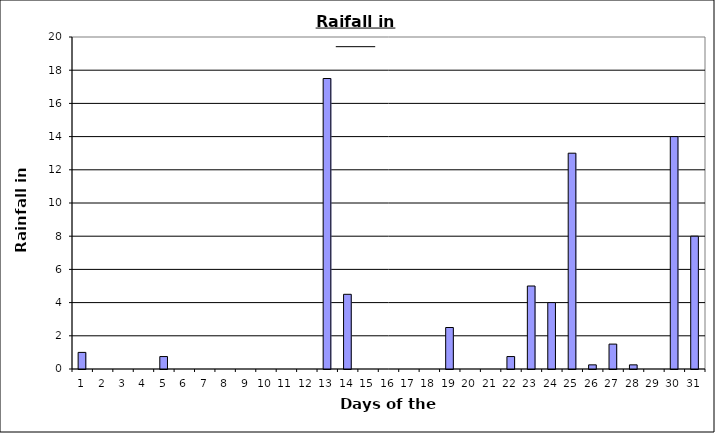
| Category | Series 0 |
|---|---|
| 0 | 1 |
| 1 | 0 |
| 2 | 0 |
| 3 | 0 |
| 4 | 0.75 |
| 5 | 0 |
| 6 | 0 |
| 7 | 0 |
| 8 | 0 |
| 9 | 0 |
| 10 | 0 |
| 11 | 0 |
| 12 | 17.5 |
| 13 | 4.5 |
| 14 | 0 |
| 15 | 0 |
| 16 | 0 |
| 17 | 0 |
| 18 | 2.5 |
| 19 | 0 |
| 20 | 0 |
| 21 | 0.75 |
| 22 | 5 |
| 23 | 4 |
| 24 | 13 |
| 25 | 0.25 |
| 26 | 1.5 |
| 27 | 0.25 |
| 28 | 0 |
| 29 | 14 |
| 30 | 8 |